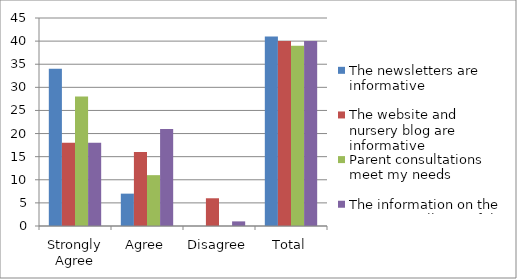
| Category | The newsletters are informative | The website and nursery blog are informative | Parent consultations meet my needs | The information on the Parents' Wall is useful |
|---|---|---|---|---|
| Strongly Agree | 34 | 18 | 28 | 18 |
| Agree | 7 | 16 | 11 | 21 |
| Disagree | 0 | 6 | 0 | 1 |
| Total | 41 | 40 | 39 | 40 |